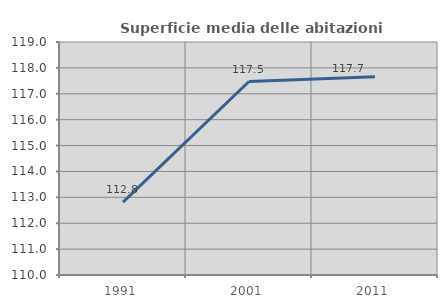
| Category | Superficie media delle abitazioni occupate |
|---|---|
| 1991.0 | 112.812 |
| 2001.0 | 117.473 |
| 2011.0 | 117.661 |